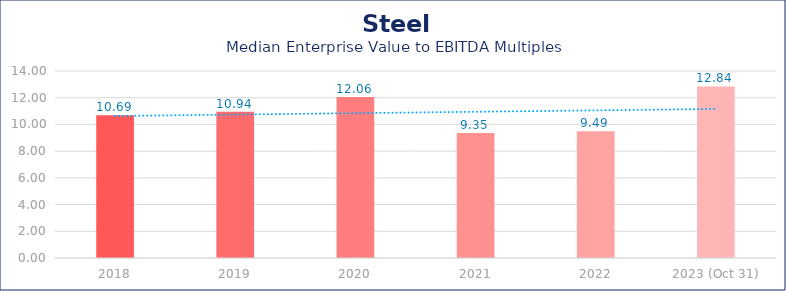
| Category | Steel |
|---|---|
| 2018 | 10.69 |
| 2019 | 10.94 |
| 2020 | 12.06 |
| 2021 | 9.35 |
| 2022 | 9.49 |
| 2023 (Oct 31) | 12.84 |